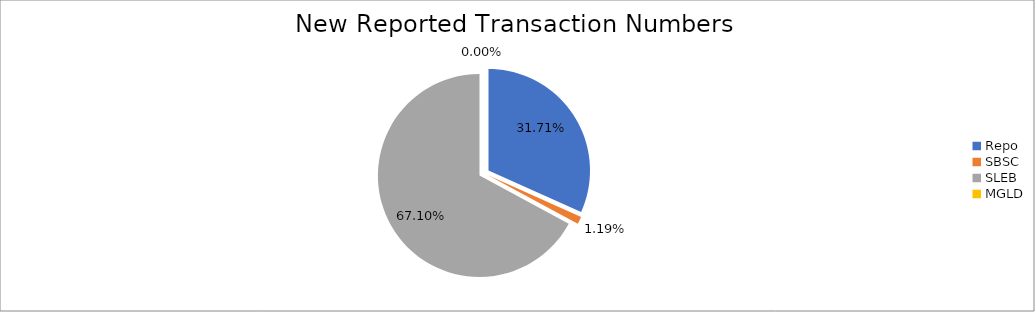
| Category | Series 0 |
|---|---|
| Repo | 323679 |
| SBSC | 12193 |
| SLEB | 684903 |
| MGLD | 17 |